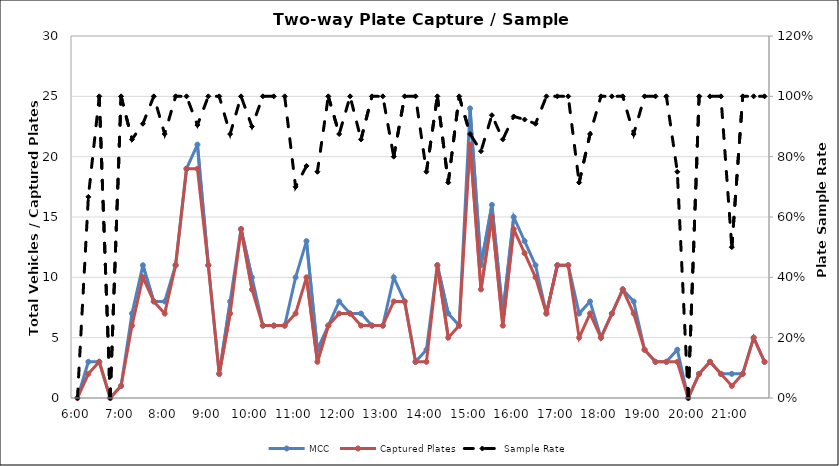
| Category | MCC | Captured Plates |
|---|---|---|
| 0.25 | 0 | 0 |
| 0.260416666666667 | 3 | 2 |
| 0.270833333333333 | 3 | 3 |
| 0.28125 | 0 | 0 |
| 0.291666666666667 | 1 | 1 |
| 0.302083333333333 | 7 | 6 |
| 0.3125 | 11 | 10 |
| 0.322916666666667 | 8 | 8 |
| 0.333333333333333 | 8 | 7 |
| 0.34375 | 11 | 11 |
| 0.354166666666667 | 19 | 19 |
| 0.364583333333333 | 21 | 19 |
| 0.375 | 11 | 11 |
| 0.385416666666667 | 2 | 2 |
| 0.395833333333333 | 8 | 7 |
| 0.40625 | 14 | 14 |
| 0.416666666666667 | 10 | 9 |
| 0.427083333333333 | 6 | 6 |
| 0.4375 | 6 | 6 |
| 0.447916666666667 | 6 | 6 |
| 0.458333333333333 | 10 | 7 |
| 0.46875 | 13 | 10 |
| 0.479166666666667 | 4 | 3 |
| 0.489583333333333 | 6 | 6 |
| 0.5 | 8 | 7 |
| 0.510416666666667 | 7 | 7 |
| 0.520833333333333 | 7 | 6 |
| 0.53125 | 6 | 6 |
| 0.541666666666667 | 6 | 6 |
| 0.552083333333333 | 10 | 8 |
| 0.5625 | 8 | 8 |
| 0.572916666666667 | 3 | 3 |
| 0.583333333333333 | 4 | 3 |
| 0.59375 | 11 | 11 |
| 0.604166666666667 | 7 | 5 |
| 0.614583333333333 | 6 | 6 |
| 0.625 | 24 | 21 |
| 0.635416666666667 | 11 | 9 |
| 0.645833333333333 | 16 | 15 |
| 0.65625 | 7 | 6 |
| 0.666666666666667 | 15 | 14 |
| 0.677083333333333 | 13 | 12 |
| 0.6875 | 11 | 10 |
| 0.697916666666667 | 7 | 7 |
| 0.708333333333333 | 11 | 11 |
| 0.71875 | 11 | 11 |
| 0.729166666666667 | 7 | 5 |
| 0.739583333333333 | 8 | 7 |
| 0.75 | 5 | 5 |
| 0.760416666666667 | 7 | 7 |
| 0.770833333333333 | 9 | 9 |
| 0.78125 | 8 | 7 |
| 0.791666666666667 | 4 | 4 |
| 0.802083333333333 | 3 | 3 |
| 0.8125 | 3 | 3 |
| 0.822916666666667 | 4 | 3 |
| 0.833333333333333 | 0 | 0 |
| 0.84375 | 2 | 2 |
| 0.854166666666667 | 3 | 3 |
| 0.864583333333333 | 2 | 2 |
| 0.875 | 2 | 1 |
| 0.885416666666667 | 2 | 2 |
| 0.895833333333333 | 5 | 5 |
| 0.90625 | 3 | 3 |